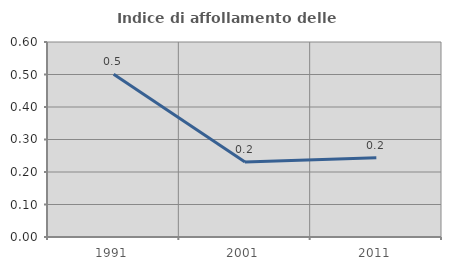
| Category | Indice di affollamento delle abitazioni  |
|---|---|
| 1991.0 | 0.501 |
| 2001.0 | 0.231 |
| 2011.0 | 0.244 |